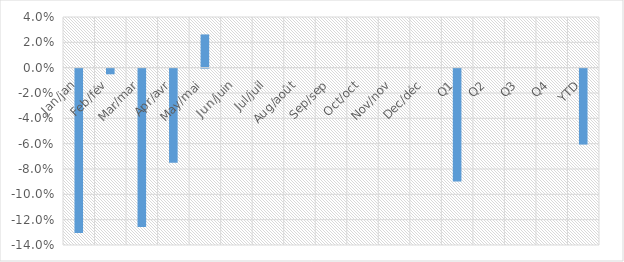
| Category | Total YoY % Change |
|---|---|
| Jan/jan | -0.13 |
| Feb/fév | -0.004 |
| Mar/mar | -0.125 |
| Apr/avr | -0.074 |
| May/mai | 0.026 |
| Jun/juin | 0 |
| Jul/juil | 0 |
| Aug/août | 0 |
| Sep/sep | 0 |
| Oct/oct | 0 |
| Nov/nov | 0 |
| Dec/déc | 0 |
| Q1 | -0.089 |
| Q2 | 0 |
| Q3 | 0 |
| Q4 | 0 |
| YTD | -0.06 |